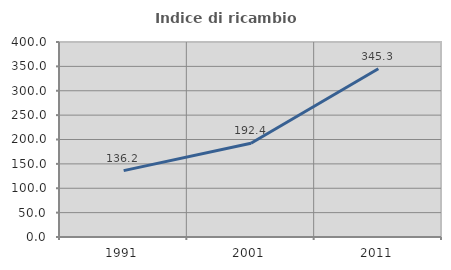
| Category | Indice di ricambio occupazionale  |
|---|---|
| 1991.0 | 136.17 |
| 2001.0 | 192.424 |
| 2011.0 | 345.283 |